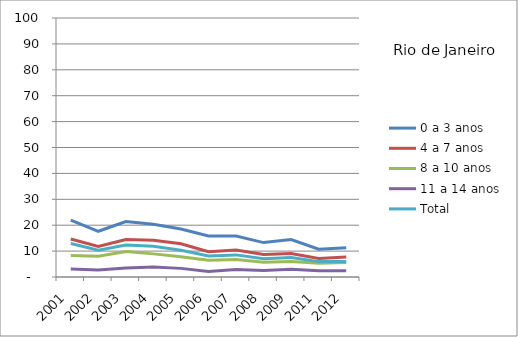
| Category | 0 a 3 anos | 4 a 7 anos | 8 a 10 anos | 11 a 14 anos | Total |
|---|---|---|---|---|---|
| 2001.0 | 21.97 | 14.67 | 8.32 | 3.05 | 12.92 |
| 2002.0 | 17.65 | 11.8 | 8.06 | 2.75 | 10.36 |
| 2003.0 | 21.41 | 14.45 | 9.88 | 3.43 | 12.34 |
| 2004.0 | 20.39 | 14.23 | 8.93 | 3.86 | 11.83 |
| 2005.0 | 18.51 | 12.82 | 7.79 | 3.33 | 10.34 |
| 2006.0 | 15.87 | 9.75 | 6.47 | 2.15 | 8.13 |
| 2007.0 | 15.83 | 10.44 | 6.78 | 2.9 | 8.54 |
| 2008.0 | 13.28 | 8.7 | 5.73 | 2.54 | 7.02 |
| 2009.0 | 14.45 | 9.1 | 6.01 | 2.95 | 7.55 |
| 2011.0 | 10.75 | 7.14 | 5.34 | 2.42 | 5.94 |
| 2012.0 | 11.28 | 7.7 | 5.59 | 2.41 | 6.02 |